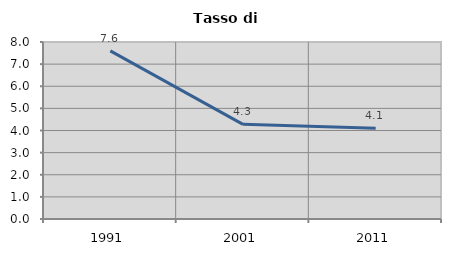
| Category | Tasso di disoccupazione   |
|---|---|
| 1991.0 | 7.601 |
| 2001.0 | 4.278 |
| 2011.0 | 4.098 |